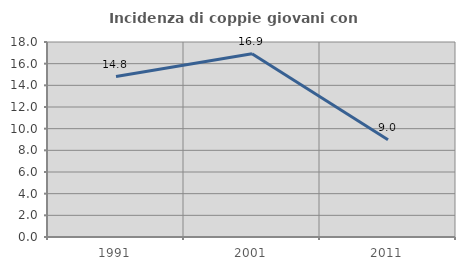
| Category | Incidenza di coppie giovani con figli |
|---|---|
| 1991.0 | 14.815 |
| 2001.0 | 16.908 |
| 2011.0 | 8.986 |